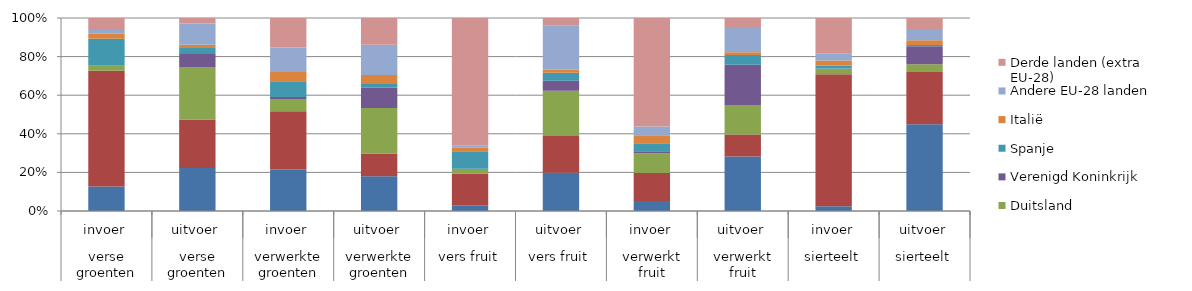
| Category | Frankrijk | Nederland | Duitsland | Verenigd Koninkrijk | Spanje | Italië | Andere EU-28 landen | Derde landen (extra EU-28) |
|---|---|---|---|---|---|---|---|---|
| 0 | 84.348 | 400.162 | 18.78 | 0.888 | 90.143 | 17.63 | 12.774 | 41.529 |
| 1 | 148.85 | 168.791 | 180.019 | 46.75 | 20.655 | 11.475 | 73.551 | 19.131 |
| 2 | 206.279 | 290.154 | 59.834 | 10.567 | 77.757 | 46.31 | 122.003 | 146.635 |
| 3 | 291.914 | 192.616 | 384.272 | 169.394 | 31.023 | 75.931 | 256.208 | 224.736 |
| 4 | 69.804 | 381.569 | 52.403 | 3.993 | 208.837 | 43.983 | 28.454 | 1529.039 |
| 5 | 356.768 | 343.74 | 424.439 | 93.191 | 73.485 | 29.114 | 412.062 | 71.64 |
| 6 | 61.891 | 170.795 | 120.164 | 12.39 | 48.754 | 49.704 | 52.734 | 664.106 |
| 7 | 328.479 | 133.083 | 174.638 | 246.512 | 58.037 | 17.281 | 146.119 | 60.119 |
| 8 | 9.154 | 257.171 | 10.585 | 0.625 | 5.732 | 9.742 | 13.264 | 69.691 |
| 9 | 206.16 | 123.814 | 18.428 | 42.303 | 3.538 | 11.192 | 24.122 | 28.479 |